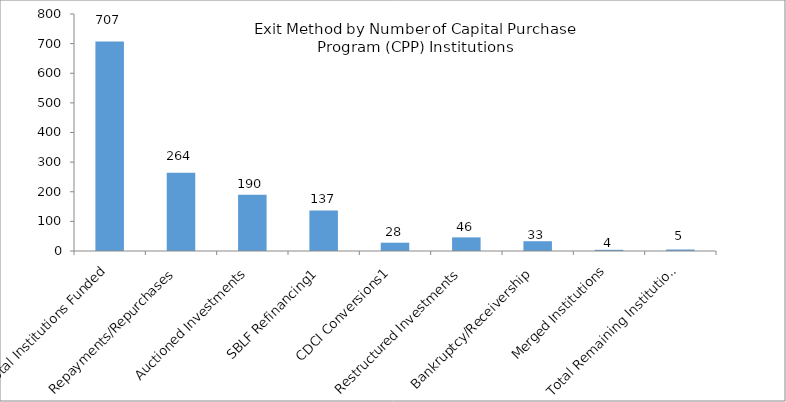
| Category | Series 0 |
|---|---|
| Total Institutions Funded | 707 |
| Repayments/Repurchases | 264 |
| Auctioned Investments | 190 |
| SBLF Refinancing1 | 137 |
| CDCI Conversions1 | 28 |
| Restructured Investments | 46 |
| Bankruptcy/Receivership | 33 |
| Merged Institutions | 4 |
| Total Remaining Institutions | 5 |